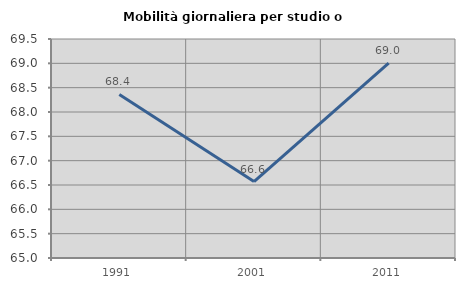
| Category | Mobilità giornaliera per studio o lavoro |
|---|---|
| 1991.0 | 68.361 |
| 2001.0 | 66.571 |
| 2011.0 | 69.004 |